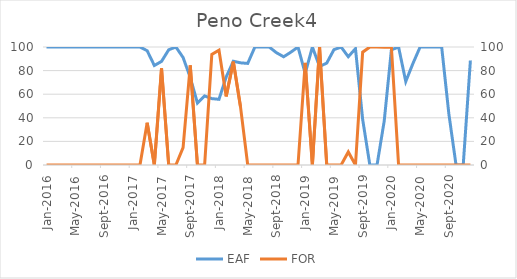
| Category | EAF |
|---|---|
| 2016-01-01 | 100 |
| 2016-02-01 | 100 |
| 2016-03-01 | 100 |
| 2016-04-01 | 100 |
| 2016-05-01 | 100 |
| 2016-06-01 | 100 |
| 2016-07-01 | 100 |
| 2016-08-01 | 100 |
| 2016-09-01 | 100 |
| 2016-10-01 | 100 |
| 2016-11-01 | 100 |
| 2016-12-01 | 100 |
| 2017-01-01 | 100 |
| 2017-02-01 | 100 |
| 2017-03-01 | 96.84 |
| 2017-04-01 | 84.31 |
| 2017-05-01 | 87.8 |
| 2017-06-01 | 97.64 |
| 2017-07-01 | 100 |
| 2017-08-01 | 91.13 |
| 2017-09-01 | 74.18 |
| 2017-10-01 | 52.46 |
| 2017-11-01 | 58.5 |
| 2017-12-01 | 56.26 |
| 2018-01-01 | 55.67 |
| 2018-02-01 | 74.59 |
| 2018-03-01 | 87.93 |
| 2018-04-01 | 86.58 |
| 2018-05-01 | 86.09 |
| 2018-06-01 | 100 |
| 2018-07-01 | 100 |
| 2018-08-01 | 99.95 |
| 2018-09-01 | 95.16 |
| 2018-10-01 | 91.72 |
| 2018-11-01 | 95.6 |
| 2018-12-01 | 100 |
| 2019-01-01 | 77.59 |
| 2019-02-01 | 100 |
| 2019-03-01 | 83.45 |
| 2019-04-01 | 86.39 |
| 2019-05-01 | 97.75 |
| 2019-06-01 | 99.94 |
| 2019-07-01 | 91.78 |
| 2019-08-01 | 98.6 |
| 2019-09-01 | 38.66 |
| 2019-10-01 | 0 |
| 2019-11-01 | 0 |
| 2019-12-01 | 37.23 |
| 2020-01-01 | 97.59 |
| 2020-02-01 | 100 |
| 2020-03-01 | 70.75 |
| 2020-04-01 | 86.06 |
| 2020-05-01 | 100 |
| 2020-06-01 | 100 |
| 2020-07-01 | 100 |
| 2020-08-01 | 100 |
| 2020-09-01 | 43.33 |
| 2020-10-01 | 0 |
| 2020-11-01 | 0 |
| 2020-12-01 | 88.58 |